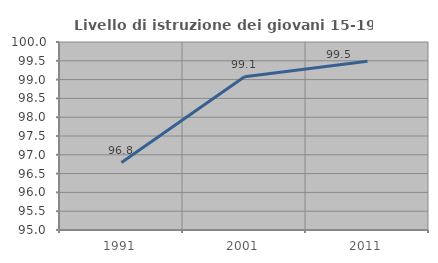
| Category | Livello di istruzione dei giovani 15-19 anni |
|---|---|
| 1991.0 | 96.795 |
| 2001.0 | 99.074 |
| 2011.0 | 99.49 |